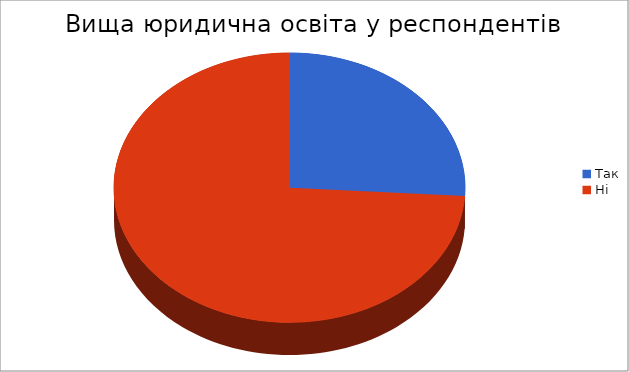
| Category | Series 0 |
|---|---|
| Так | 13 |
| Ні | 37 |